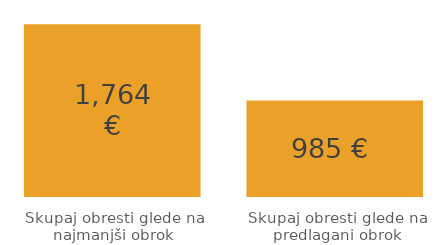
| Category | Series 0 |
|---|---|
| Skupaj obresti glede na najmanjši obrok | 1763.952 |
| Skupaj obresti glede na predlagani obrok | 984.811 |